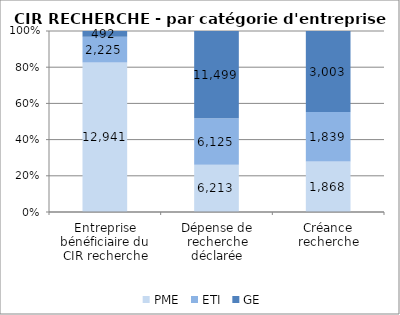
| Category | PME | ETI | GE |
|---|---|---|---|
| Entreprise bénéficiaire du CIR recherche | 12941 | 2225 | 492 |
| Dépense de recherche déclarée | 6212.74 | 6124.63 | 11499.43 |
| Créance recherche | 1867.67 | 1838.57 | 3003.24 |